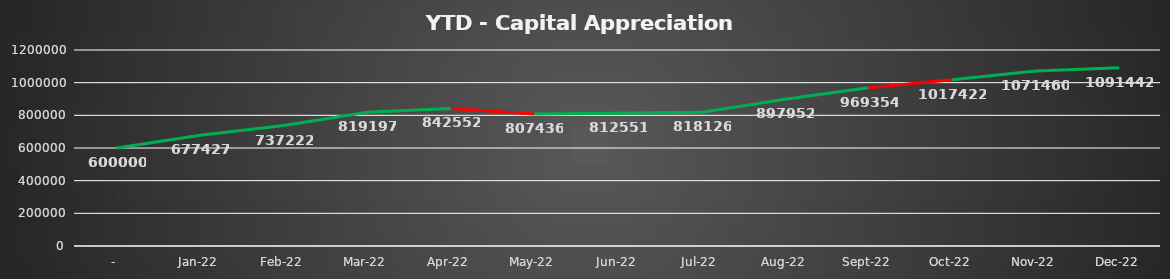
| Category | Capital Appreciation |
|---|---|
| - | 600000 |
| Jan-22 | 677426.7 |
| Feb-22 | 737221.7 |
| Mar-22 | 819196.7 |
| Apr-22 | 842551.75 |
| May-22 | 807435.55 |
| Jun-22 | 812550.55 |
| Jul-22 | 818125.55 |
| Aug-22 | 897951.75 |
| Sep-22 | 969354.35 |
| Oct-22 | 1017421.85 |
| Nov-22 | 1071459.85 |
| Dec-22 | 1091442.35 |